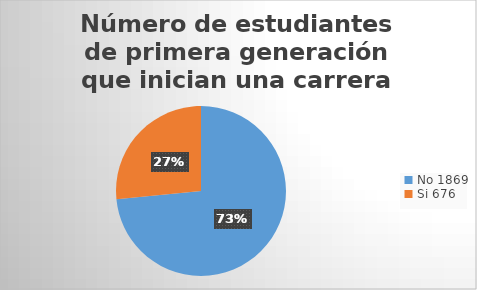
| Category | Número de estudiantes de primera generación que inician una carrera |
|---|---|
| 0 | 1869 |
| 1 | 676 |